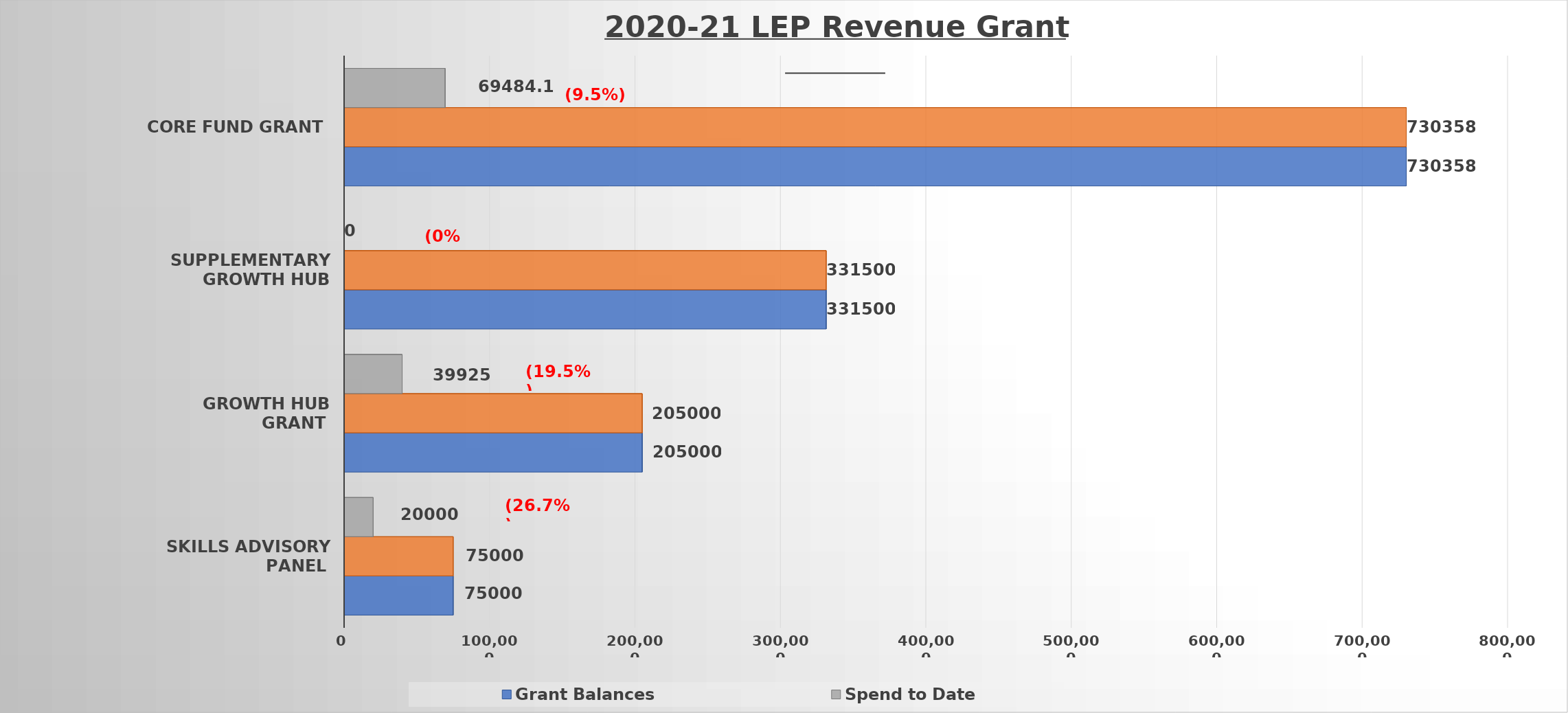
| Category | Grant Balances | Forecast | Spend to Date |
|---|---|---|---|
| Skills Advisory Panel  | 75000 | 75000 | 20000 |
| Growth Hub Grant  | 205000 | 205000 | 39925 |
| Supplementary Growth Hub Grant  | 331500 | 331500 | 0 |
| Core Fund Grant | 730358 | 730358 | 69484.19 |